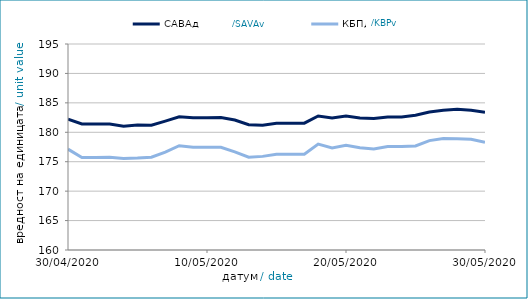
| Category | САВАд | КБПд |
|---|---|---|
| 30/04/2020 | 182.218 | 177.134 |
| 01/05/2020 | 181.412 | 175.725 |
| 02/05/2020 | 181.417 | 175.732 |
| 03/05/2020 | 181.422 | 175.739 |
| 04/05/2020 | 181.037 | 175.559 |
| 05/05/2020 | 181.222 | 175.611 |
| 06/05/2020 | 181.213 | 175.754 |
| 07/05/2020 | 181.899 | 176.629 |
| 08/05/2020 | 182.635 | 177.718 |
| 09/05/2020 | 182.457 | 177.452 |
| 10/05/2020 | 182.462 | 177.458 |
| 11/05/2020 | 182.513 | 177.465 |
| 12/05/2020 | 182.081 | 176.684 |
| 13/05/2020 | 181.281 | 175.771 |
| 14/05/2020 | 181.208 | 175.907 |
| 15/05/2020 | 181.553 | 176.269 |
| 16/05/2020 | 181.543 | 176.254 |
| 17/05/2020 | 181.548 | 176.261 |
| 18/05/2020 | 182.767 | 177.994 |
| 19/05/2020 | 182.415 | 177.348 |
| 20/05/2020 | 182.778 | 177.809 |
| 21/05/2020 | 182.433 | 177.378 |
| 22/05/2020 | 182.326 | 177.158 |
| 23/05/2020 | 182.612 | 177.579 |
| 24/05/2020 | 182.617 | 177.586 |
| 25/05/2020 | 182.885 | 177.67 |
| 26/05/2020 | 183.429 | 178.582 |
| 27/05/2020 | 183.745 | 178.96 |
| 28/05/2020 | 183.933 | 178.905 |
| 29/05/2020 | 183.736 | 178.825 |
| 30/05/2020 | 183.39 | 178.304 |